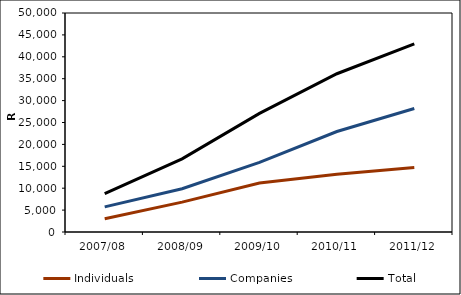
| Category | Individuals | Companies | Total |
|---|---|---|---|
| 2007/08 | 3016.825 | 5735.008 | 8751.833 |
| 2008/09 | 6823.562 | 9870.923 | 16694.485 |
| 2009/10 | 11180.518 | 15893.769 | 27074.287 |
| 2010/11 | 13192.616 | 22942.888 | 36135.504 |
| 2011/12 | 14742.839 | 28206.093 | 42948.932 |